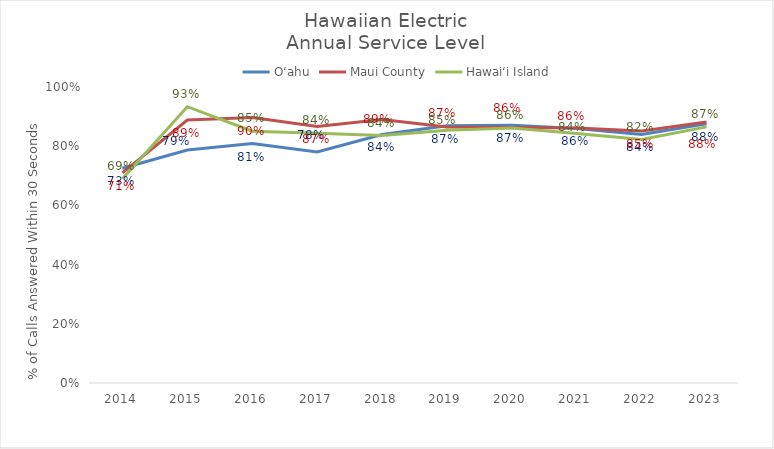
| Category | O‘ahu | Maui County | Hawai‘i Island |
|---|---|---|---|
| 2014.0 | 0.726 | 0.71 | 0.69 |
| 2015.0 | 0.787 | 0.888 | 0.933 |
| 2016.0 | 0.809 | 0.897 | 0.851 |
| 2017.0 | 0.78 | 0.867 | 0.844 |
| 2018.0 | 0.84 | 0.89 | 0.836 |
| 2019.0 | 0.869 | 0.865 | 0.854 |
| 2020.0 | 0.871 | 0.863 | 0.861 |
| 2021.0 | 0.86 | 0.861 | 0.843 |
| 2022.0 | 0.84 | 0.851 | 0.822 |
| 2023.0 | 0.876 | 0.881 | 0.865 |